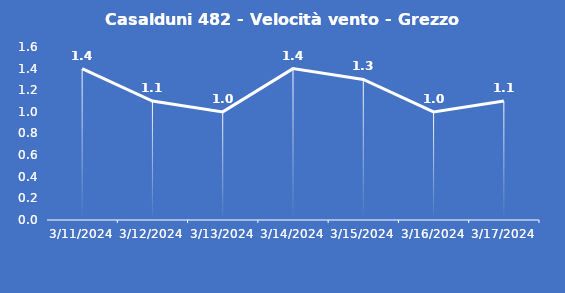
| Category | Casalduni 482 - Velocità vento - Grezzo (m/s) |
|---|---|
| 3/11/24 | 1.4 |
| 3/12/24 | 1.1 |
| 3/13/24 | 1 |
| 3/14/24 | 1.4 |
| 3/15/24 | 1.3 |
| 3/16/24 | 1 |
| 3/17/24 | 1.1 |